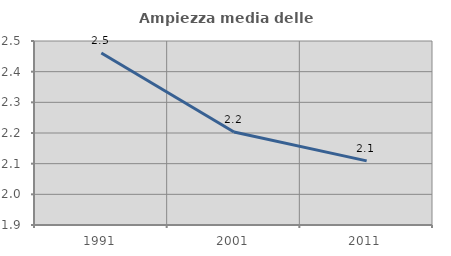
| Category | Ampiezza media delle famiglie |
|---|---|
| 1991.0 | 2.461 |
| 2001.0 | 2.203 |
| 2011.0 | 2.109 |